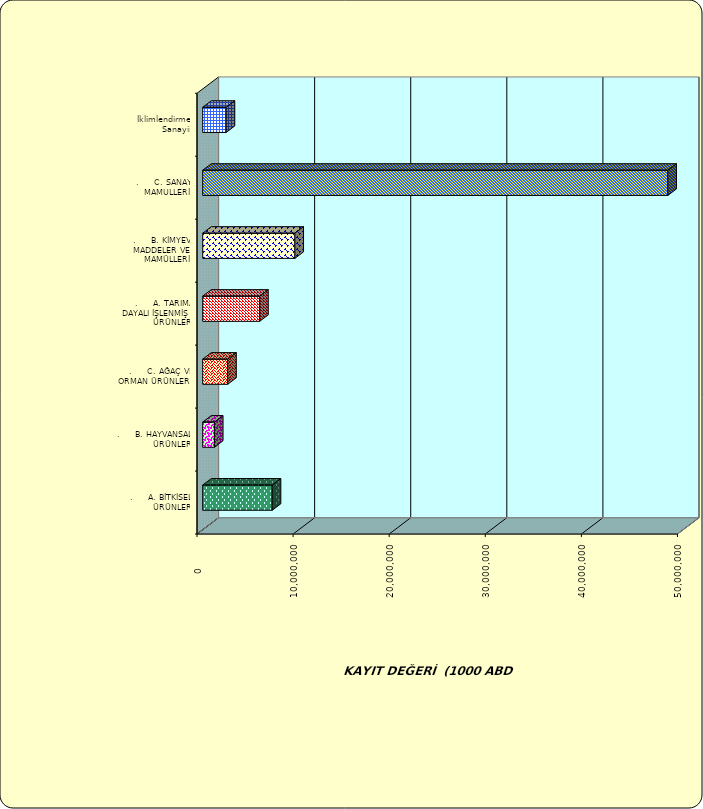
| Category | Series 0 |
|---|---|
| .     A. BİTKİSEL ÜRÜNLER | 7234816.774 |
| .     B. HAYVANSAL ÜRÜNLER | 1221159.601 |
| .     C. AĞAÇ VE ORMAN ÜRÜNLERİ | 2601225.561 |
| .     A. TARIMA DAYALI İŞLENMİŞ ÜRÜNLER | 5927926.312 |
| .     B. KİMYEVİ MADDELER VE MAMÜLLERİ | 9597643.495 |
| .     C. SANAYİ MAMULLERİ | 48408972.854 |
|  İklimlendirme Sanayii | 2441396.779 |